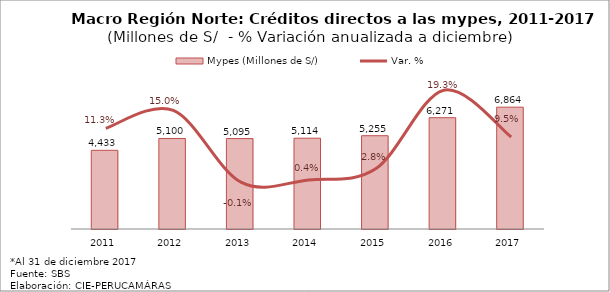
| Category | Mypes (Millones de S/) |
|---|---|
| 2011.0 | 4432.982 |
| 2012.0 | 5099.954 |
| 2013.0 | 5094.861 |
| 2014.0 | 5113.61 |
| 2015.0 | 5255.305 |
| 2016.0 | 6270.881 |
| 2017.0 | 6863.625 |